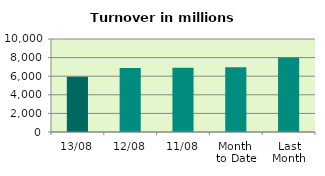
| Category | Series 0 |
|---|---|
| 13/08 | 5953.506 |
| 12/08 | 6893.845 |
| 11/08 | 6903.581 |
| Month 
to Date | 6957.13 |
| Last
Month | 8019.786 |